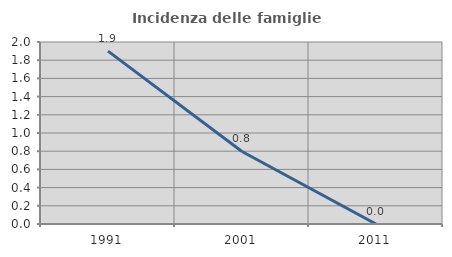
| Category | Incidenza delle famiglie numerose |
|---|---|
| 1991.0 | 1.9 |
| 2001.0 | 0.797 |
| 2011.0 | 0 |